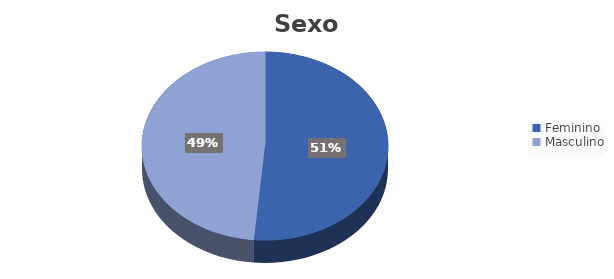
| Category | Series 0 |
|---|---|
| Feminino | 0.514 |
| Masculino | 0.486 |